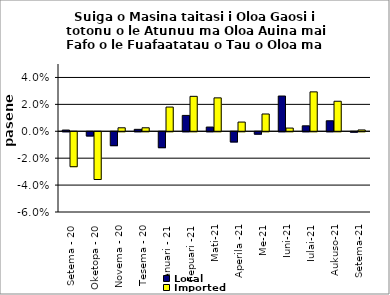
| Category | Local | Imported |
|---|---|---|
| Setema - 20 | 0.001 | -0.026 |
| Oketopa - 20 | -0.003 | -0.035 |
| Novema - 20 | -0.01 | 0.003 |
| Tesema - 20 | 0.001 | 0.003 |
| Ianuari - 21 | -0.012 | 0.018 |
| Fepuari -21 | 0.012 | 0.026 |
| Mati-21 | 0.003 | 0.025 |
| Aperila -21 | -0.008 | 0.007 |
| Me-21 | -0.002 | 0.013 |
| Iuni-21 | 0.026 | 0.002 |
| Iulai-21 | 0.004 | 0.029 |
| Aukuso-21 | 0.008 | 0.022 |
| Setema-21 | 0 | 0.001 |